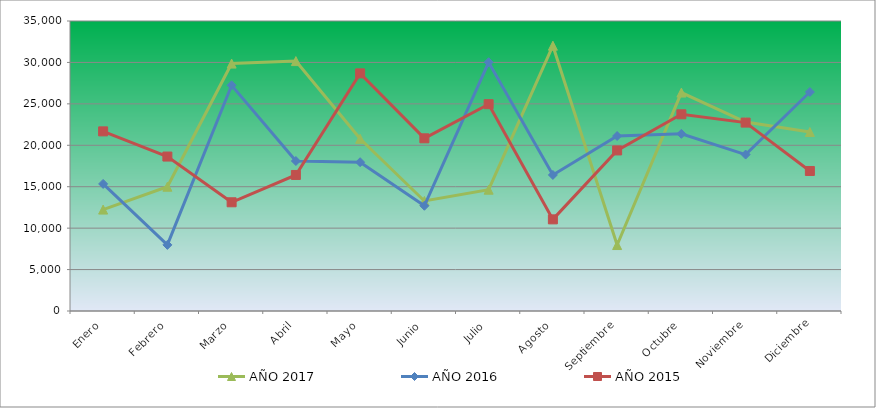
| Category | AÑO 2017 | AÑO 2016 | AÑO 2015 |
|---|---|---|---|
| Enero | 12240 | 15340 | 21680 |
| Febrero | 15000 | 7980 | 18640 |
| Marzo | 29860 | 27240 | 13120 |
| Abril | 30160 | 18100 | 16420 |
| Mayo | 20780 | 17960 | 28680 |
| Junio | 13280 | 12700 | 20840 |
| Julio | 14640 | 30020 | 24960 |
| Agosto | 32020 | 16420 | 11060 |
| Septiembre | 7960 | 21120 | 19380 |
| Octubre | 26360 | 21380 | 23740 |
| Noviembre | 22800 | 18880 | 22740 |
| Diciembre | 21600 | 26430 | 16900 |